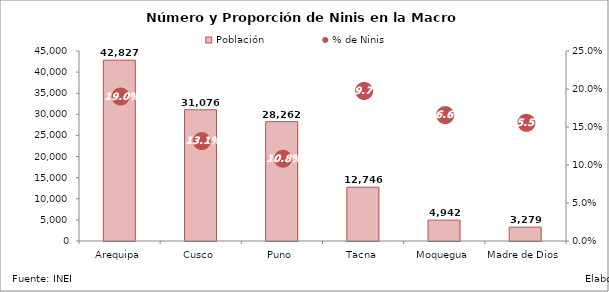
| Category | Población |
|---|---|
| Arequipa | 42826.63 |
| Cusco | 31075.76 |
| Puno | 28262.06 |
| Tacna | 12745.96 |
| Moquegua | 4942.45 |
| Madre de Dios | 3279.31 |